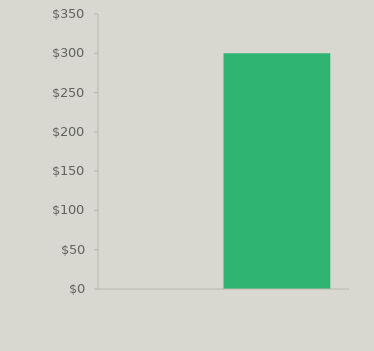
| Category | Income | Expenses |
|---|---|---|
| 0 | 0 | 300 |